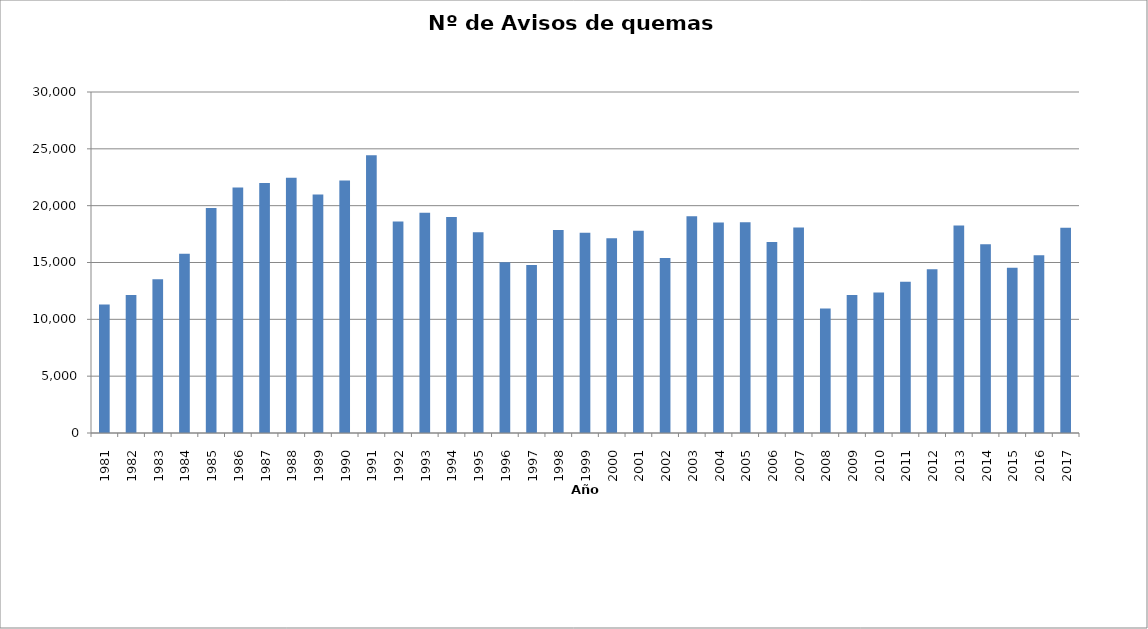
| Category | Series 0 |
|---|---|
| 1981.0 | 11302 |
| 1982.0 | 12134 |
| 1983.0 | 13519 |
| 1984.0 | 15762 |
| 1985.0 | 19789 |
| 1986.0 | 21605 |
| 1987.0 | 21996 |
| 1988.0 | 22452 |
| 1989.0 | 20992 |
| 1990.0 | 22209 |
| 1991.0 | 24432 |
| 1992.0 | 18615 |
| 1993.0 | 19374 |
| 1994.0 | 19013 |
| 1995.0 | 17660 |
| 1996.0 | 15011 |
| 1997.0 | 14790 |
| 1998.0 | 17855 |
| 1999.0 | 17620 |
| 2000.0 | 17127 |
| 2001.0 | 17801 |
| 2002.0 | 15385 |
| 2003.0 | 19067 |
| 2004.0 | 18511 |
| 2005.0 | 18547 |
| 2006.0 | 16814 |
| 2007.0 | 18087 |
| 2008.0 | 10953 |
| 2009.0 | 12144 |
| 2010.0 | 12369 |
| 2011.0 | 13315 |
| 2012.0 | 14403 |
| 2013.0 | 18264 |
| 2014.0 | 16598 |
| 2015.0 | 14543 |
| 2016.0 | 15644 |
| 2017.0 | 18050 |